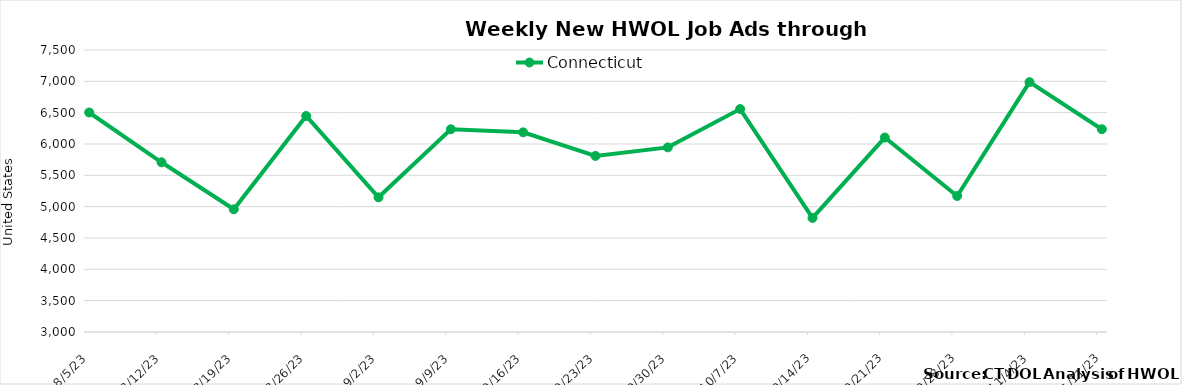
| Category | Connecticut |
|---|---|
| 8/5/23 | 6503 |
| 8/12/23 | 5708 |
| 8/19/23 | 4958 |
| 8/26/23 | 6447 |
| 9/2/23 | 5149 |
| 9/9/23 | 6235 |
| 9/16/23 | 6186 |
| 9/23/23 | 5810 |
| 9/30/23 | 5946 |
| 10/7/23 | 6558 |
| 10/14/23 | 4820 |
| 10/21/23 | 6103 |
| 10/28/23 | 5171 |
| 11/4/23 | 6987 |
| 11/11/23 | 6236 |